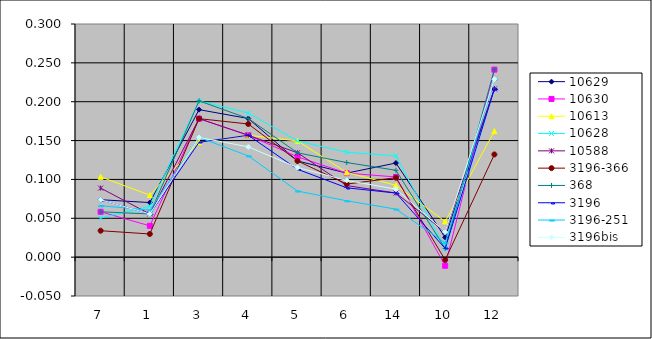
| Category | 10629 | 10630 | 10613 | 10628 | 10588 | 3196-366 | 368 | 3196 | 3196-251 | 3196bis |
|---|---|---|---|---|---|---|---|---|---|---|
| 7.0 | 0.074 | 0.058 | 0.103 | 0.05 | 0.089 | 0.034 | 0.058 | 0.074 | 0.066 | 0.074 |
| 1.0 | 0.07 | 0.04 | 0.08 | 0.065 | 0.056 | 0.03 | 0.056 | 0.056 | 0.06 | 0.056 |
| 3.0 | 0.19 | 0.178 | 0.148 | 0.201 | 0.178 | 0.178 | 0.201 | 0.148 | 0.154 | 0.154 |
| 4.0 | 0.178 | 0.157 | 0.157 | 0.185 | 0.157 | 0.171 | 0.178 | 0.157 | 0.13 | 0.142 |
| 5.0 | 0.124 | 0.129 | 0.149 | 0.149 | 0.134 | 0.124 | 0.134 | 0.113 | 0.085 | 0.115 |
| 6.0 | 0.108 | 0.108 | 0.109 | 0.135 | 0.092 | 0.094 | 0.122 | 0.089 | 0.072 | 0.099 |
| 14.0 | 0.121 | 0.103 | 0.092 | 0.13 | 0.082 | 0.102 | 0.112 | 0.082 | 0.062 | 0.087 |
| 10.0 | 0.025 | -0.011 | 0.046 | 0.011 | 0.032 | -0.004 | 0.011 | 0.011 | 0.018 | 0.032 |
| 12.0 | 0.216 | 0.241 | 0.162 | 0.216 | 0.216 | 0.132 | 0.241 | 0.216 | 0.229 | 0.229 |